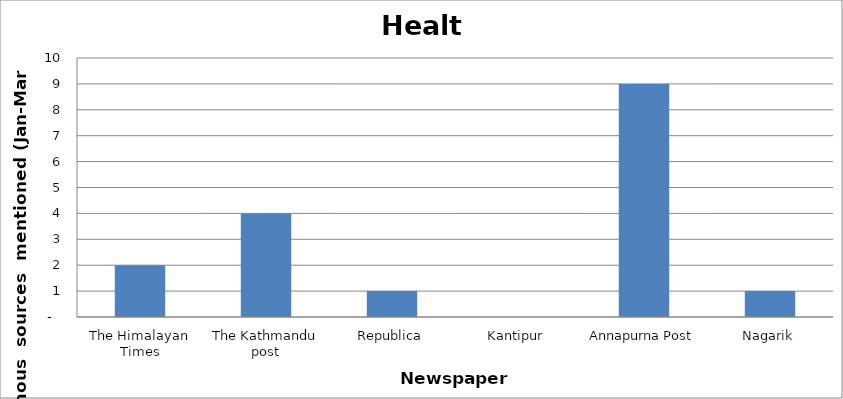
| Category | Health |
|---|---|
| The Himalayan Times | 2 |
| The Kathmandu post | 4 |
| Republica | 1 |
| Kantipur | 0 |
| Annapurna Post | 9 |
| Nagarik | 1 |